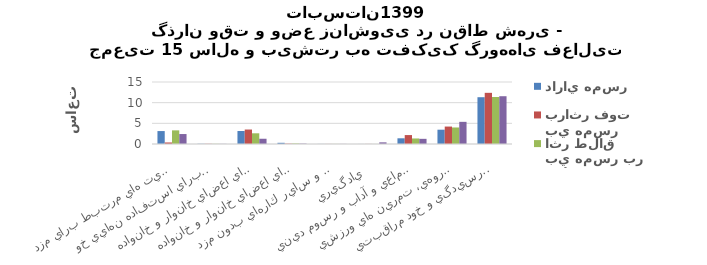
| Category | داراي همسر | بي همسر براثر فوت | بي همسر بر اثر طلاق | هرگز ازدواج نكرده |
|---|---|---|---|---|
| اشتغال و فعاليت هاي مرتبط براي مزد  | 3.13 | 0.37 | 3.3 | 2.41 |
| توليد كالا براي استفاده نهايي خود   | 0.05 | 0.05 | 0.04 | 0.03 |
| خدمات خانگي بدون مزد براي اعضاي خانوار و خانواده   | 3.14 | 3.5 | 2.59 | 1.27 |
| خدمات مراقبتي بدون مزد براي اعضاي خانوار و خانواده   | 0.29 | 0.09 | 0.13 | 0.09 |
| كارداوطلبانه بدون مزد، كار آموزي و ساير كارهاي بدون مزد  | 0.02 | 0.02 | 0.02 | 0.02 |
| يادگيري  | 0.01 | 0.02 | 0.01 | 0.4 |
| معاشرت، ارتباط، مشاركت اجتماعي و آداب و رسوم ديني  | 1.38 | 2.16 | 1.34 | 1.25 |
| فرهنگ، فراغت، رسانه هاي گروهي، تمرين هاي ورزشي  | 3.46 | 4.22 | 4 | 5.36 |
| رسيدگي و خود مراقبتي   | 11.32 | 12.38 | 11.37 | 11.56 |